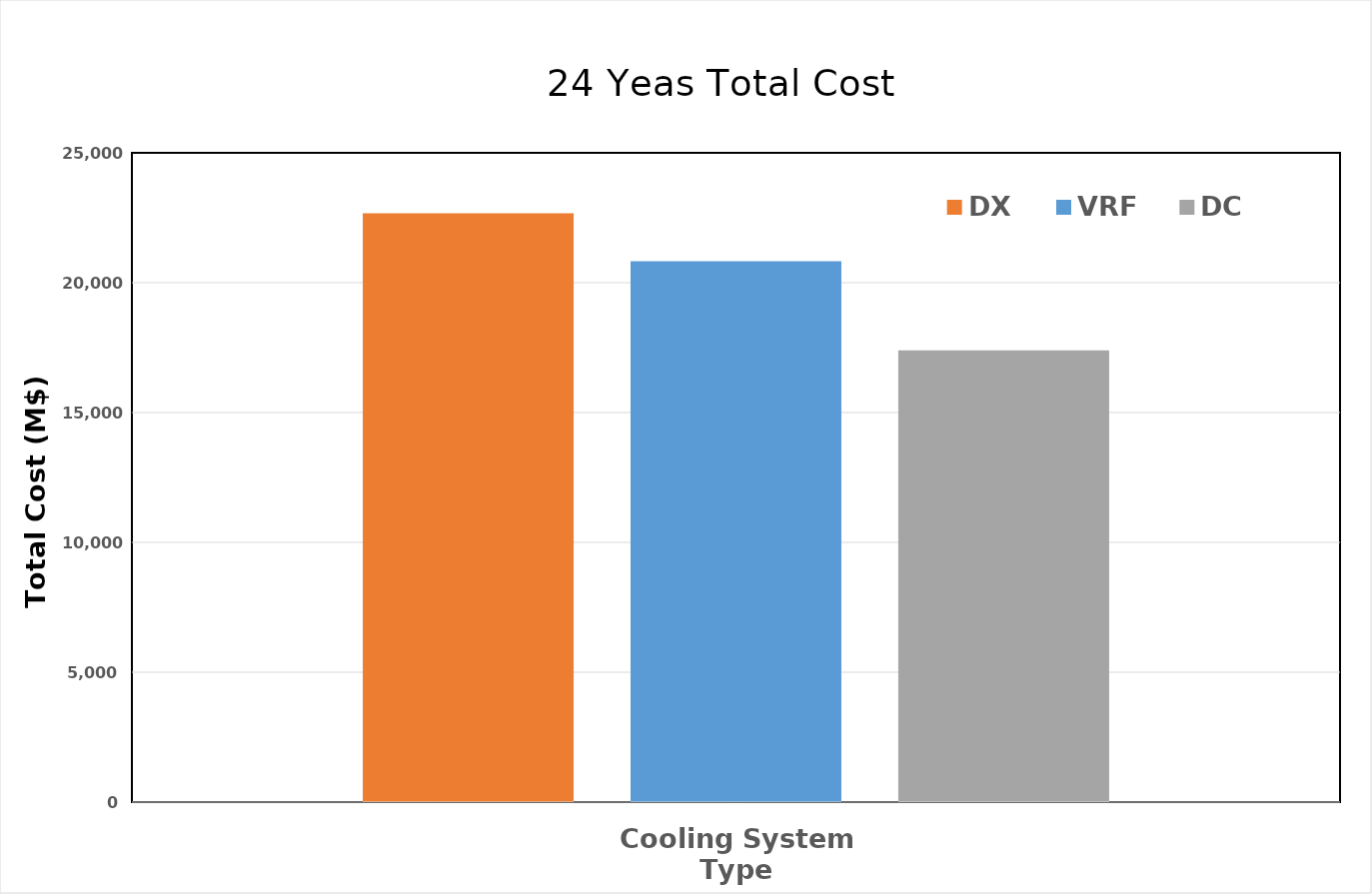
| Category | DX | VRF | DC |
|---|---|---|---|
| 0 | 22668.508 | 20828.696 | 17394.977 |